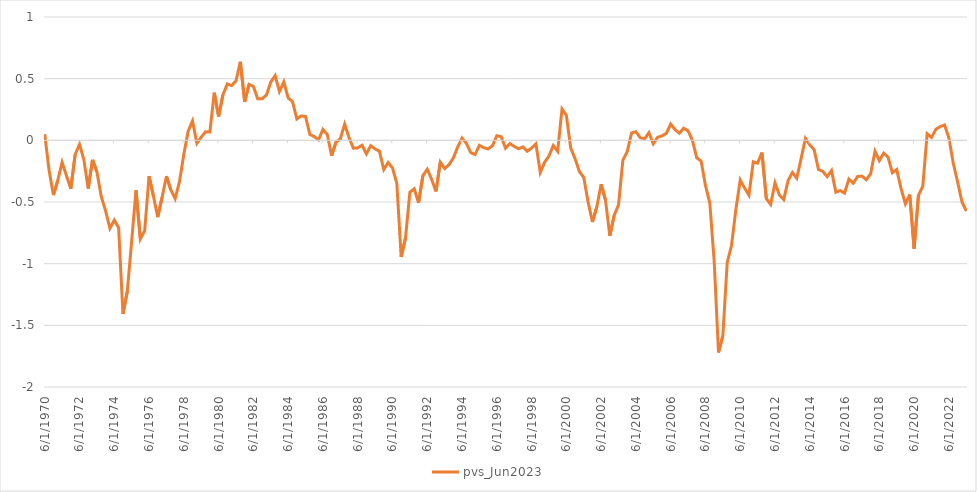
| Category | pvs_Jun2023 |
|---|---|
| 6/30/70 | 0.05 |
| 9/30/70 | -0.243 |
| 12/31/70 | -0.444 |
| 3/31/71 | -0.326 |
| 6/30/71 | -0.178 |
| 9/30/71 | -0.286 |
| 12/31/71 | -0.393 |
| 3/31/72 | -0.116 |
| 6/30/72 | -0.032 |
| 9/30/72 | -0.156 |
| 12/31/72 | -0.391 |
| 3/31/73 | -0.159 |
| 6/30/73 | -0.255 |
| 9/30/73 | -0.455 |
| 12/31/73 | -0.572 |
| 3/31/74 | -0.713 |
| 6/30/74 | -0.647 |
| 9/30/74 | -0.709 |
| 12/31/74 | -1.408 |
| 3/31/75 | -1.224 |
| 6/30/75 | -0.818 |
| 9/30/75 | -0.406 |
| 12/31/75 | -0.8 |
| 3/31/76 | -0.732 |
| 6/30/76 | -0.291 |
| 9/30/76 | -0.45 |
| 12/31/76 | -0.622 |
| 3/31/77 | -0.463 |
| 6/30/77 | -0.291 |
| 9/30/77 | -0.4 |
| 12/31/77 | -0.473 |
| 3/31/78 | -0.336 |
| 6/30/78 | -0.113 |
| 9/30/78 | 0.075 |
| 12/31/78 | 0.157 |
| 3/31/79 | -0.024 |
| 6/30/79 | 0.026 |
| 9/30/79 | 0.069 |
| 12/31/79 | 0.068 |
| 3/31/80 | 0.386 |
| 6/30/80 | 0.194 |
| 9/30/80 | 0.37 |
| 12/31/80 | 0.457 |
| 3/31/81 | 0.444 |
| 6/30/81 | 0.482 |
| 9/30/81 | 0.637 |
| 12/31/81 | 0.312 |
| 3/31/82 | 0.454 |
| 6/30/82 | 0.437 |
| 9/30/82 | 0.336 |
| 12/31/82 | 0.336 |
| 3/31/83 | 0.367 |
| 6/30/83 | 0.472 |
| 9/30/83 | 0.525 |
| 12/31/83 | 0.396 |
| 3/31/84 | 0.474 |
| 6/30/84 | 0.344 |
| 9/30/84 | 0.314 |
| 12/31/84 | 0.173 |
| 3/31/85 | 0.198 |
| 6/30/85 | 0.193 |
| 9/30/85 | 0.048 |
| 12/31/85 | 0.03 |
| 3/31/86 | 0.004 |
| 6/30/86 | 0.088 |
| 9/30/86 | 0.047 |
| 12/31/86 | -0.125 |
| 3/31/87 | -0.016 |
| 6/30/87 | 0.012 |
| 9/30/87 | 0.131 |
| 12/31/87 | 0.022 |
| 3/31/88 | -0.063 |
| 6/30/88 | -0.061 |
| 9/30/88 | -0.04 |
| 12/31/88 | -0.11 |
| 3/31/89 | -0.043 |
| 6/30/89 | -0.069 |
| 9/30/89 | -0.088 |
| 12/31/89 | -0.237 |
| 3/31/90 | -0.18 |
| 6/30/90 | -0.223 |
| 9/30/90 | -0.349 |
| 12/31/90 | -0.945 |
| 3/31/91 | -0.791 |
| 6/30/91 | -0.422 |
| 9/30/91 | -0.393 |
| 12/31/91 | -0.506 |
| 3/31/92 | -0.286 |
| 6/30/92 | -0.234 |
| 9/30/92 | -0.316 |
| 12/31/92 | -0.414 |
| 3/31/93 | -0.177 |
| 6/30/93 | -0.229 |
| 9/30/93 | -0.197 |
| 12/31/93 | -0.143 |
| 3/31/94 | -0.055 |
| 6/30/94 | 0.018 |
| 9/30/94 | -0.024 |
| 12/31/94 | -0.1 |
| 3/31/95 | -0.115 |
| 6/30/95 | -0.041 |
| 9/30/95 | -0.06 |
| 12/31/95 | -0.07 |
| 3/31/96 | -0.044 |
| 6/30/96 | 0.037 |
| 9/30/96 | 0.03 |
| 12/31/96 | -0.064 |
| 3/31/97 | -0.026 |
| 6/30/97 | -0.049 |
| 9/30/97 | -0.068 |
| 12/31/97 | -0.054 |
| 3/31/98 | -0.089 |
| 6/30/98 | -0.062 |
| 9/30/98 | -0.029 |
| 12/31/98 | -0.261 |
| 3/31/99 | -0.178 |
| 6/30/99 | -0.126 |
| 9/30/99 | -0.042 |
| 12/31/99 | -0.089 |
| 3/31/00 | 0.254 |
| 6/30/00 | 0.203 |
| 9/30/00 | -0.062 |
| 12/31/00 | -0.149 |
| 3/31/01 | -0.253 |
| 6/30/01 | -0.3 |
| 9/30/01 | -0.5 |
| 12/31/01 | -0.662 |
| 3/31/02 | -0.54 |
| 6/30/02 | -0.356 |
| 9/30/02 | -0.484 |
| 12/31/02 | -0.774 |
| 3/31/03 | -0.609 |
| 6/30/03 | -0.523 |
| 9/30/03 | -0.161 |
| 12/31/03 | -0.092 |
| 3/31/04 | 0.06 |
| 6/30/04 | 0.071 |
| 9/30/04 | 0.022 |
| 12/31/04 | 0.012 |
| 3/31/05 | 0.063 |
| 6/30/05 | -0.027 |
| 9/30/05 | 0.024 |
| 12/31/05 | 0.036 |
| 3/31/06 | 0.057 |
| 6/30/06 | 0.131 |
| 9/30/06 | 0.086 |
| 12/31/06 | 0.058 |
| 3/31/07 | 0.098 |
| 6/30/07 | 0.076 |
| 9/30/07 | 0 |
| 12/31/07 | -0.141 |
| 3/31/08 | -0.168 |
| 6/30/08 | -0.366 |
| 9/30/08 | -0.509 |
| 12/31/08 | -0.976 |
| 3/31/09 | -1.72 |
| 6/30/09 | -1.585 |
| 9/30/09 | -0.992 |
| 12/31/09 | -0.851 |
| 3/31/10 | -0.56 |
| 6/30/10 | -0.321 |
| 9/30/10 | -0.387 |
| 12/31/10 | -0.444 |
| 3/31/11 | -0.173 |
| 6/30/11 | -0.184 |
| 9/30/11 | -0.099 |
| 12/31/11 | -0.473 |
| 3/31/12 | -0.52 |
| 6/30/12 | -0.345 |
| 9/30/12 | -0.443 |
| 12/31/12 | -0.48 |
| 3/31/13 | -0.328 |
| 6/30/13 | -0.26 |
| 9/30/13 | -0.307 |
| 12/31/13 | -0.149 |
| 3/31/14 | 0.016 |
| 6/30/14 | -0.038 |
| 9/30/14 | -0.076 |
| 12/31/14 | -0.236 |
| 3/31/15 | -0.252 |
| 6/30/15 | -0.295 |
| 9/30/15 | -0.245 |
| 12/31/15 | -0.42 |
| 3/31/16 | -0.408 |
| 6/30/16 | -0.428 |
| 9/30/16 | -0.314 |
| 12/31/16 | -0.347 |
| 3/31/17 | -0.293 |
| 6/30/17 | -0.29 |
| 9/30/17 | -0.32 |
| 12/31/17 | -0.271 |
| 3/31/18 | -0.089 |
| 6/30/18 | -0.165 |
| 9/30/18 | -0.104 |
| 12/31/18 | -0.136 |
| 3/31/19 | -0.263 |
| 6/30/19 | -0.237 |
| 9/30/19 | -0.392 |
| 12/31/19 | -0.515 |
| 3/31/20 | -0.44 |
| 6/30/20 | -0.878 |
| 9/30/20 | -0.446 |
| 12/31/20 | -0.372 |
| 3/31/21 | 0.053 |
| 6/30/21 | 0.023 |
| 9/30/21 | 0.09 |
| 12/31/21 | 0.111 |
| 3/31/22 | 0.125 |
| 6/30/22 | 0.019 |
| 9/30/22 | -0.184 |
| 12/31/22 | -0.336 |
| 3/31/23 | -0.498 |
| 6/30/23 | -0.573 |